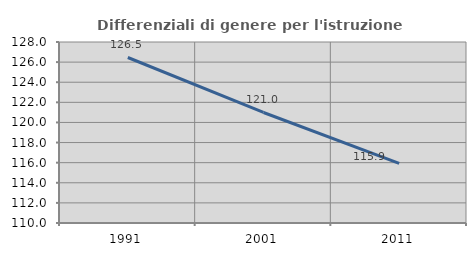
| Category | Differenziali di genere per l'istruzione superiore |
|---|---|
| 1991.0 | 126.459 |
| 2001.0 | 120.991 |
| 2011.0 | 115.927 |